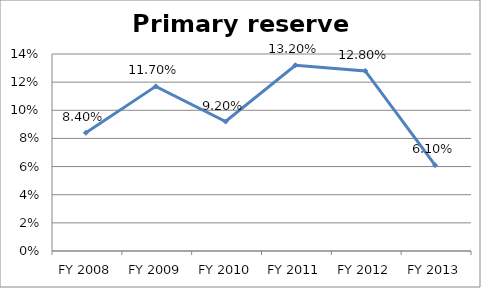
| Category | Primary reserve ratio |
|---|---|
| FY 2013 | 0.061 |
| FY 2012 | 0.128 |
| FY 2011 | 0.132 |
| FY 2010 | 0.092 |
| FY 2009 | 0.117 |
| FY 2008 | 0.084 |